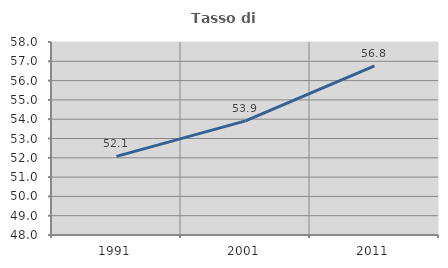
| Category | Tasso di occupazione   |
|---|---|
| 1991.0 | 52.075 |
| 2001.0 | 53.915 |
| 2011.0 | 56.767 |